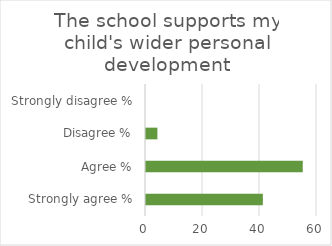
| Category | Series 1 |
|---|---|
| Strongly agree % | 41 |
| Agree % | 55 |
| Disagree % | 4 |
| Strongly disagree % | 0 |